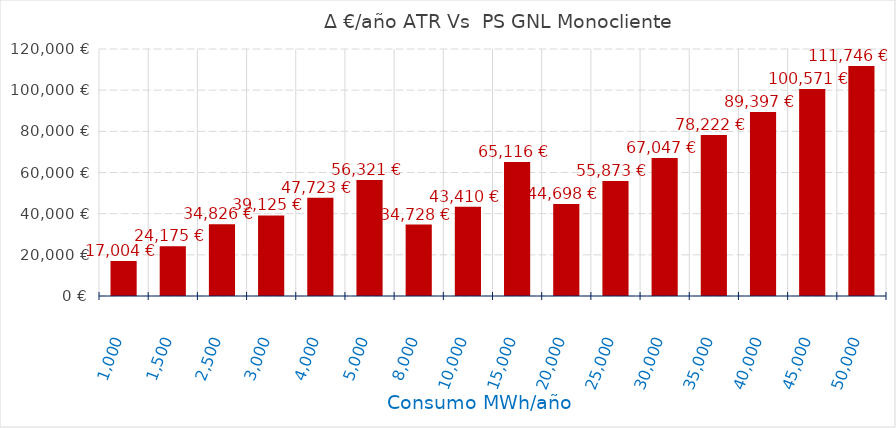
| Category | D €/año |
|---|---|
| 1000.0 | 17004.313 |
| 1500.0 | 24174.895 |
| 2500.0 | 34825.636 |
| 3000.0 | 39124.719 |
| 4000.0 | 47722.884 |
| 5000.0 | 56321.049 |
| 8000.0 | 34728.32 |
| 10000.0 | 43410.4 |
| 15000.0 | 65115.6 |
| 20000.0 | 44698.254 |
| 25000.0 | 55872.818 |
| 30000.0 | 67047.381 |
| 35000.0 | 78221.945 |
| 40000.0 | 89396.509 |
| 45000.0 | 100571.072 |
| 50000.0 | 111745.636 |